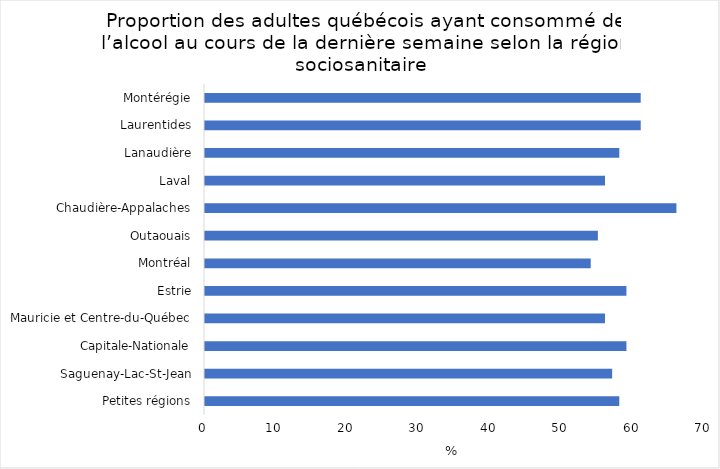
| Category | Series 0 |
|---|---|
| Petites régions | 58 |
| Saguenay-Lac-St-Jean | 57 |
| Capitale-Nationale | 59 |
| Mauricie et Centre-du-Québec | 56 |
| Estrie | 59 |
| Montréal | 54 |
| Outaouais | 55 |
| Chaudière-Appalaches | 66 |
| Laval | 56 |
| Lanaudière | 58 |
| Laurentides | 61 |
| Montérégie | 61 |